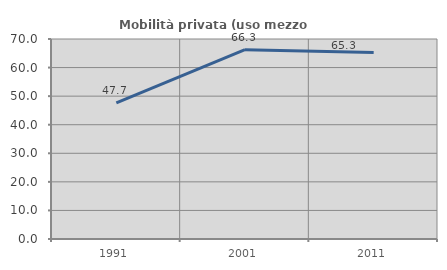
| Category | Mobilità privata (uso mezzo privato) |
|---|---|
| 1991.0 | 47.664 |
| 2001.0 | 66.279 |
| 2011.0 | 65.306 |